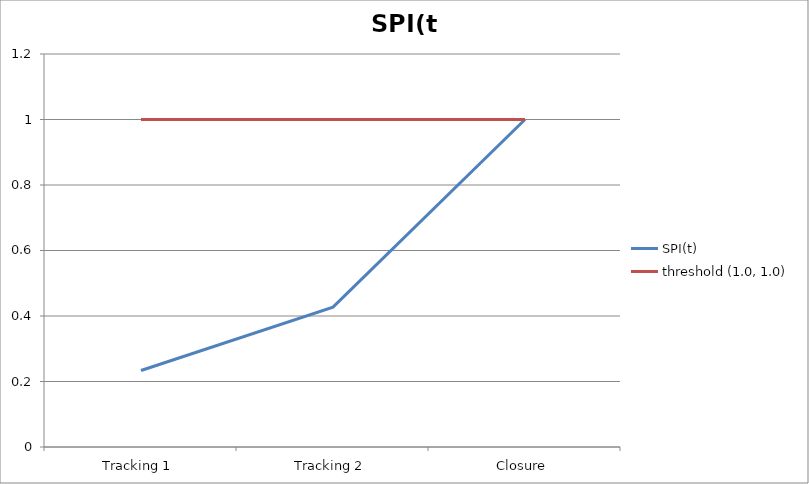
| Category | SPI(t) | threshold (1.0, 1.0) |
|---|---|---|
| Tracking 1 | 0.234 | 1 |
| Tracking 2 | 0.427 | 1 |
| Closure | 1 | 1 |